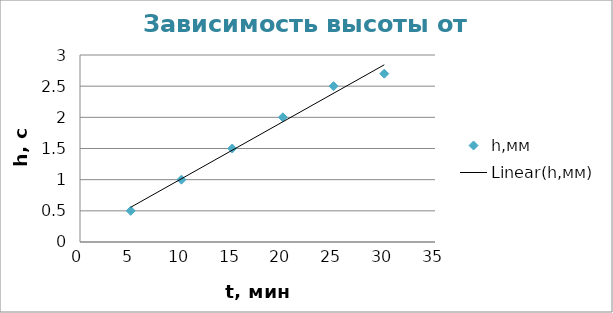
| Category | h,мм |
|---|---|
| 5.0 | 0.5 |
| 10.0 | 1 |
| 15.0 | 1.5 |
| 20.0 | 2 |
| 25.0 | 2.5 |
| 30.0 | 2.7 |